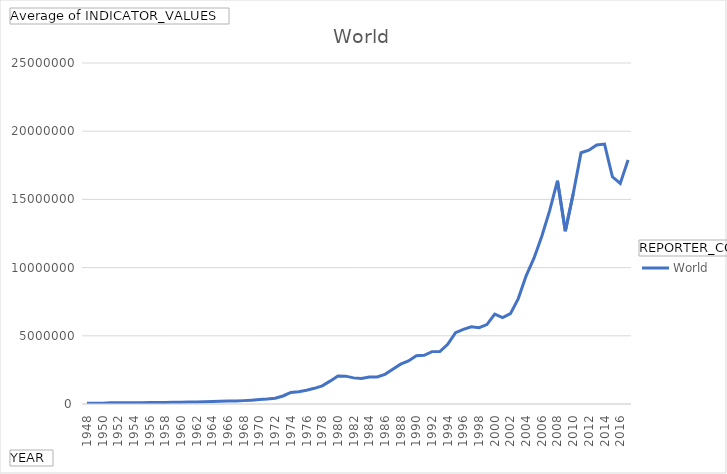
| Category | World |
|---|---|
| 1948 | 60375 |
| 1949 | 61160 |
| 1950 | 62925 |
| 1951 | 86035 |
| 1952 | 84860 |
| 1953 | 84440 |
| 1954 | 87750 |
| 1955 | 96805 |
| 1956 | 107180 |
| 1957 | 117475 |
| 1958 | 112525 |
| 1959 | 120750 |
| 1960 | 133795 |
| 1961 | 139455 |
| 1962 | 146950 |
| 1963 | 160385 |
| 1964 | 179515 |
| 1965 | 194455 |
| 1966 | 212655 |
| 1967 | 223195 |
| 1968 | 247375 |
| 1969 | 281715 |
| 1970 | 323155 |
| 1971 | 360120 |
| 1972 | 425935 |
| 1973 | 587515 |
| 1974 | 850805 |
| 1975 | 894425 |
| 1976 | 1008935 |
| 1977 | 1149450 |
| 1978 | 1332670 |
| 1979 | 1676505 |
| 1980 | 2056660.59 |
| 1981 | 2042437.194 |
| 1982 | 1914842.112 |
| 1983 | 1868767.665 |
| 1984 | 1985684.024 |
| 1985 | 1984202.71 |
| 1986 | 2173056.641 |
| 1987 | 2549611.51 |
| 1988 | 2917094.265 |
| 1989 | 3152189.636 |
| 1990 | 3544856.584 |
| 1991 | 3569903.807 |
| 1992 | 3839844.47 |
| 1993 | 3844560.052 |
| 1994 | 4378418.325 |
| 1995 | 5226445.812 |
| 1996 | 5476660.857 |
| 1997 | 5665489.699 |
| 1998 | 5592857.582 |
| 1999 | 5822830.792 |
| 2000 | 6589648.422 |
| 2001 | 6337615.554 |
| 2002 | 6619505.392 |
| 2003 | 7727221.637 |
| 2004 | 9399457.12 |
| 2005 | 10690257.207 |
| 2006 | 12296293.468 |
| 2007 | 14178404.731 |
| 2008 | 16368840.263 |
| 2009 | 12671347.397 |
| 2010 | 15408298.468 |
| 2011 | 18420822.828 |
| 2012 | 18603954.406 |
| 2013 | 18988845.807 |
| 2014 | 19053256.342 |
| 2015 | 16659563.292 |
| 2016 | 16165455.644 |
| 2017 | 17885923.458 |